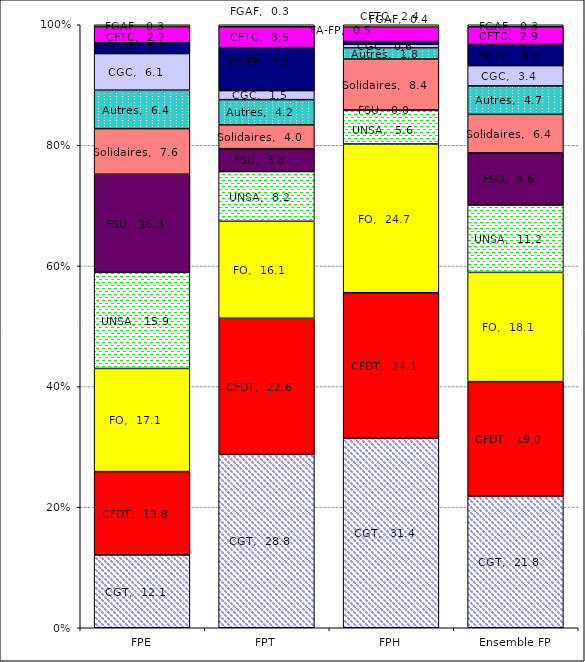
| Category | CGT | CFDT | FO | UNSA | FSU | Solidaires | Autres | CGC | FA-FP | CFTC | FGAF |
|---|---|---|---|---|---|---|---|---|---|---|---|
| FPE | 12.075 | 13.827 | 17.101 | 15.932 | 16.287 | 7.552 | 6.381 | 6.062 | 1.79 | 2.688 | 0.305 |
| FPT | 28.753 | 22.57 | 16.085 | 8.244 | 3.792 | 3.964 | 4.171 | 1.499 | 7.13 | 3.457 | 0.335 |
| FPH | 31.421 | 24.136 | 24.671 | 5.606 | 0.032 | 8.448 | 1.85 | 0.587 | 0.468 | 2.397 | 0.384 |
| Ensemble FP | 21.835 | 18.975 | 18.122 | 11.173 | 8.649 | 6.386 | 4.724 | 3.358 | 3.527 | 2.92 | 0.331 |